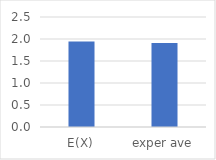
| Category | Series 0 |
|---|---|
| E(X) | 1.944 |
| exper ave | 1.907 |